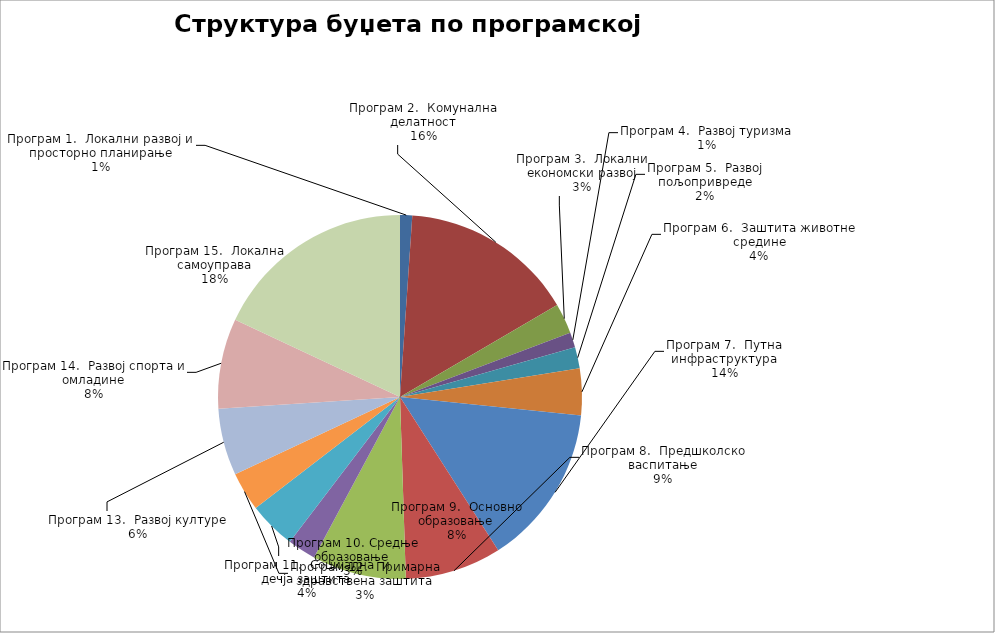
| Category | Series 0 |
|---|---|
| Програм 1.  Локални развој и просторно планирање | 9700000 |
| Програм 2.  Комунална делатност | 139300000 |
| Програм 3.  Локални економски развој | 24090000 |
| Програм 4.  Развој туризма | 11950000 |
| Програм 5.  Развој пољопривреде | 17000000 |
| Програм 6.  Заштита животне средине | 37250000 |
| Програм 7.  Путна инфраструктура | 128600000 |
| Програм 8.  Предшколско васпитање | 76920000 |
| Програм 9.  Основно образовање | 75000000 |
| Програм 10. Средње образовање | 22600000 |
| Програм 11.  Социјална  и дечја заштита | 37960000 |
| Програм 12.  Примарна здравствена заштита | 31100000 |
| Програм 13.  Развој културе | 53376000 |
| Програм 14.  Развој спорта и омладине | 71870000 |
| Програм 15.  Локална самоуправа | 162084000 |